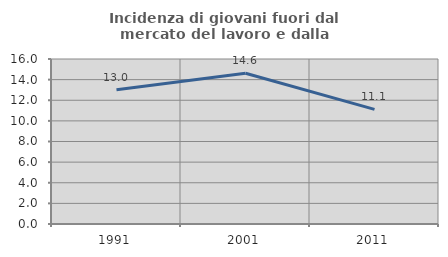
| Category | Incidenza di giovani fuori dal mercato del lavoro e dalla formazione  |
|---|---|
| 1991.0 | 13.008 |
| 2001.0 | 14.62 |
| 2011.0 | 11.111 |